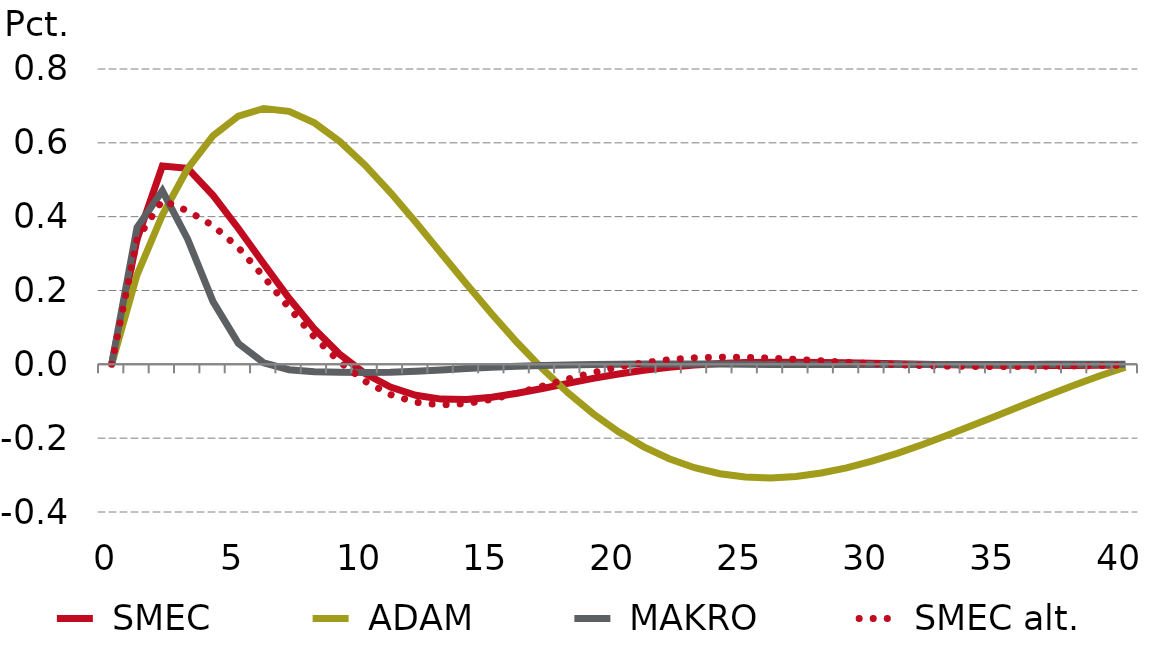
| Category |  SMEC |  ADAM |  MAKRO |  SMEC alt.  |
|---|---|---|---|---|
| 0.0 | 0 | 0 | 0 | 0 |
| nan | 0.338 | 0.242 | 0.37 | 0.338 |
| nan | 0.537 | 0.405 | 0.47 | 0.444 |
| nan | 0.531 | 0.53 | 0.339 | 0.416 |
| nan | 0.458 | 0.619 | 0.17 | 0.376 |
| 5.0 | 0.368 | 0.673 | 0.057 | 0.316 |
| nan | 0.272 | 0.693 | 0.004 | 0.237 |
| nan | 0.179 | 0.685 | -0.015 | 0.153 |
| nan | 0.096 | 0.654 | -0.02 | 0.074 |
| nan | 0.027 | 0.604 | -0.022 | 0.006 |
| 10.0 | -0.025 | 0.54 | -0.022 | -0.046 |
| nan | -0.062 | 0.465 | -0.021 | -0.082 |
| nan | -0.084 | 0.385 | -0.019 | -0.103 |
| nan | -0.094 | 0.301 | -0.015 | -0.11 |
| nan | -0.095 | 0.218 | -0.011 | -0.106 |
| 15.0 | -0.089 | 0.136 | -0.008 | -0.095 |
| nan | -0.078 | 0.059 | -0.005 | -0.078 |
| nan | -0.065 | -0.012 | -0.003 | -0.059 |
| nan | -0.052 | -0.077 | -0.002 | -0.04 |
| nan | -0.038 | -0.134 | 0 | -0.022 |
| 20.0 | -0.026 | -0.183 | 0 | -0.007 |
| nan | -0.016 | -0.223 | 0.001 | 0.004 |
| nan | -0.008 | -0.256 | 0.001 | 0.013 |
| nan | -0.002 | -0.28 | 0.001 | 0.018 |
| nan | 0.002 | -0.296 | 0.001 | 0.019 |
| 25.0 | 0.005 | -0.305 | 0 | 0.019 |
| nan | 0.006 | -0.308 | 0 | 0.017 |
| nan | 0.006 | -0.304 | 0 | 0.013 |
| nan | 0.005 | -0.295 | -0.001 | 0.01 |
| nan | 0.004 | -0.28 | 0 | 0.006 |
| 30.0 | 0.003 | -0.262 | 0 | 0.002 |
| nan | 0.001 | -0.241 | -0.001 | -0.001 |
| nan | 0 | -0.217 | 0 | -0.003 |
| nan | -0.001 | -0.191 | 0 | -0.005 |
| nan | -0.002 | -0.165 | 0 | -0.006 |
| 35.0 | -0.002 | -0.137 | 0 | -0.006 |
| nan | -0.003 | -0.109 | 0 | -0.006 |
| nan | -0.003 | -0.082 | 0 | -0.005 |
| nan | -0.003 | -0.056 | 0 | -0.004 |
| nan | -0.003 | -0.031 | 0 | -0.003 |
| 40.0 | -0.003 | -0.008 | 0 | -0.002 |